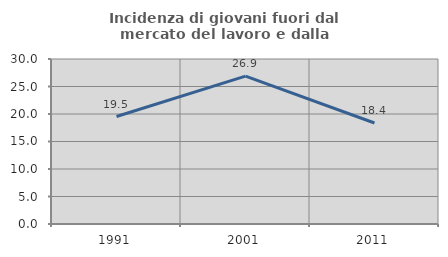
| Category | Incidenza di giovani fuori dal mercato del lavoro e dalla formazione  |
|---|---|
| 1991.0 | 19.539 |
| 2001.0 | 26.879 |
| 2011.0 | 18.363 |